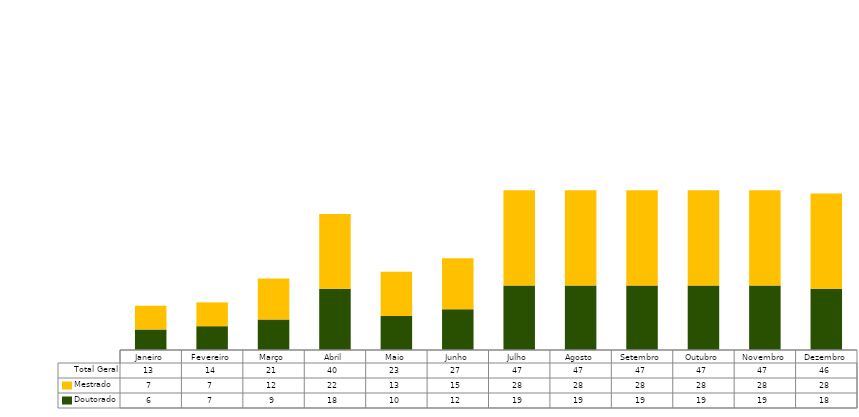
| Category | Doutorado | Mestrado | Total Geral |
|---|---|---|---|
| Janeiro | 6 | 7 | 13 |
| Fevereiro | 7 | 7 | 14 |
| Março | 9 | 12 | 21 |
| Abril | 18 | 22 | 40 |
| Maio | 10 | 13 | 23 |
| Junho | 12 | 15 | 27 |
| Julho | 19 | 28 | 47 |
| Agosto | 19 | 28 | 47 |
| Setembro | 19 | 28 | 47 |
| Outubro | 19 | 28 | 47 |
| Novembro | 19 | 28 | 47 |
| Dezembro | 18 | 28 | 46 |